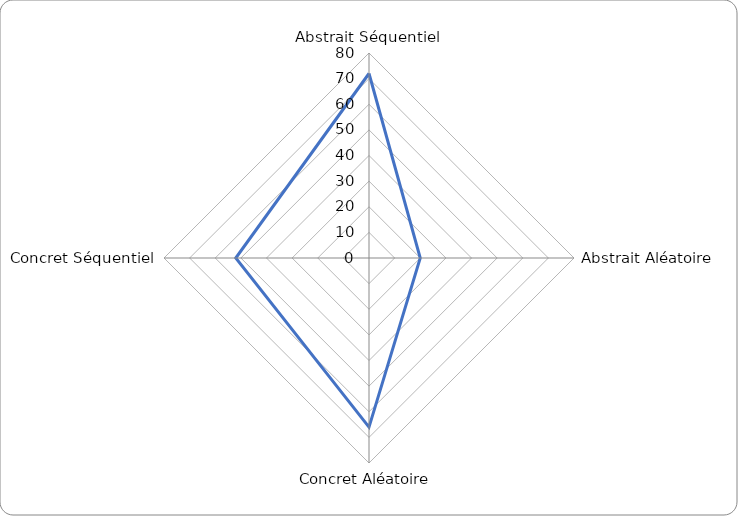
| Category | Score |
|---|---|
| Abstrait Séquentiel | 72 |
| Abstrait Aléatoire | 20 |
| Concret Aléatoire  | 66 |
| Concret Séquentiel | 52 |